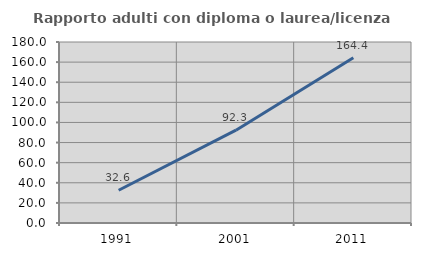
| Category | Rapporto adulti con diploma o laurea/licenza media  |
|---|---|
| 1991.0 | 32.587 |
| 2001.0 | 92.289 |
| 2011.0 | 164.431 |